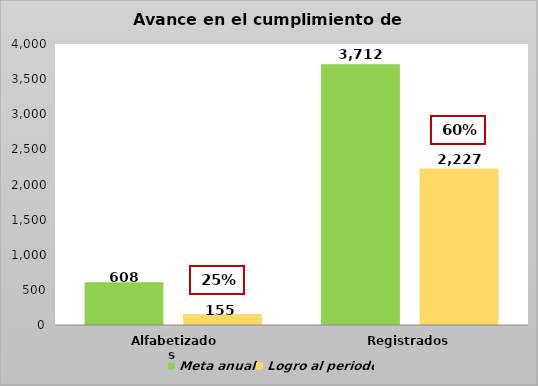
| Category | Meta anual | Logro al periodo |
|---|---|---|
| Alfabetizados  | 608 | 155 |
| Registrados | 3712 | 2227 |